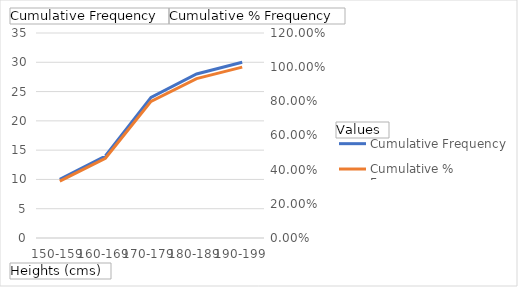
| Category | Cumulative Frequency |
|---|---|
| 150-159 | 10 |
| 160-169 | 14 |
| 170-179 | 24 |
| 180-189 | 28 |
| 190-199 | 30 |